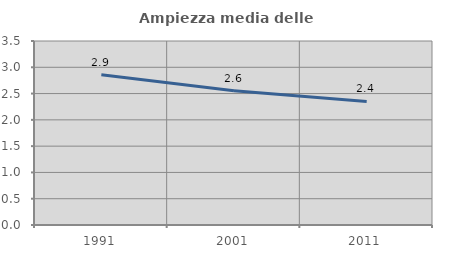
| Category | Ampiezza media delle famiglie |
|---|---|
| 1991.0 | 2.859 |
| 2001.0 | 2.552 |
| 2011.0 | 2.35 |